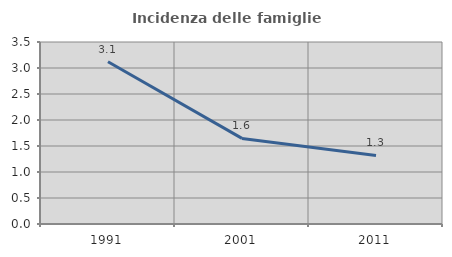
| Category | Incidenza delle famiglie numerose |
|---|---|
| 1991.0 | 3.12 |
| 2001.0 | 1.646 |
| 2011.0 | 1.319 |